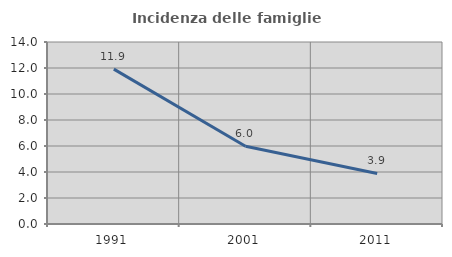
| Category | Incidenza delle famiglie numerose |
|---|---|
| 1991.0 | 11.916 |
| 2001.0 | 5.983 |
| 2011.0 | 3.891 |